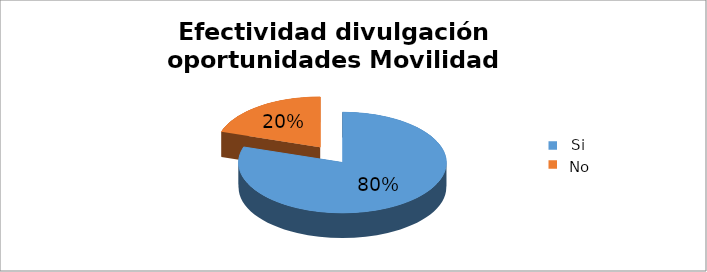
| Category | Series 0 |
|---|---|
| 0 | 0.8 |
| 1 | 0.2 |